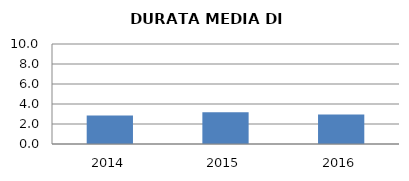
| Category | 2014 2015 2016 |
|---|---|
| 2014.0 | 2.84 |
| 2015.0 | 3.172 |
| 2016.0 | 2.947 |